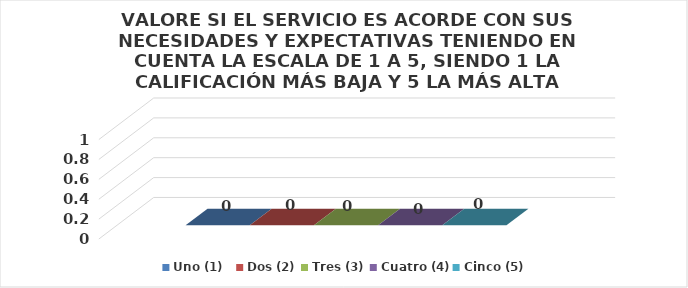
| Category | Uno (1)   | Dos (2) | Tres (3) | Cuatro (4) | Cinco (5) |
|---|---|---|---|---|---|
| 0 | 0 | 0 | 0 | 0 | 0 |